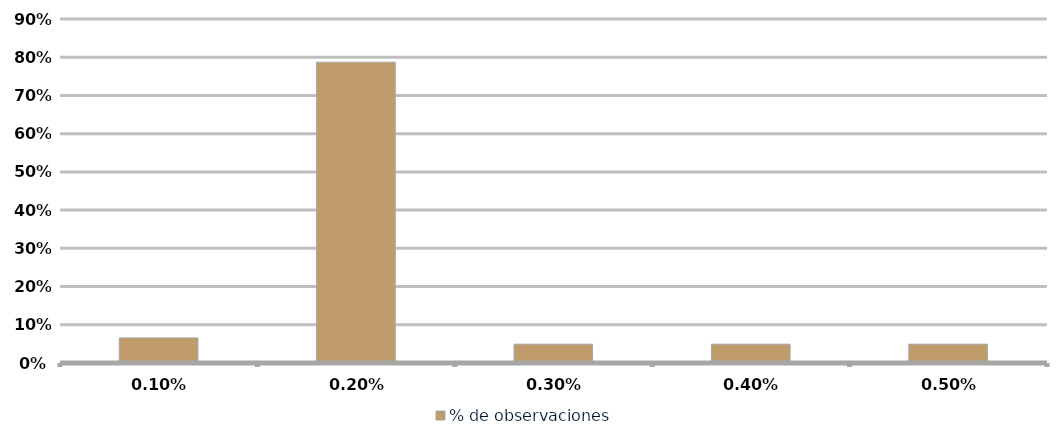
| Category | % de observaciones  |
|---|---|
| 0.001 | 0.066 |
| 0.002 | 0.787 |
| 0.003 | 0.049 |
| 0.004 | 0.049 |
| 0.005 | 0.049 |